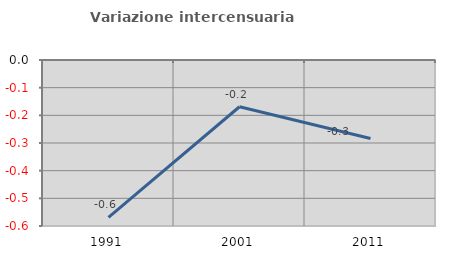
| Category | Variazione intercensuaria annua |
|---|---|
| 1991.0 | -0.569 |
| 2001.0 | -0.169 |
| 2011.0 | -0.284 |